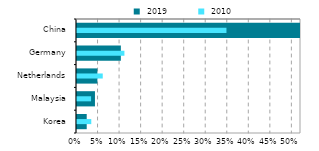
| Category |  2019 |
|---|---|
| Korea | 0.023 |
| Malaysia | 0.042 |
| Netherlands | 0.047 |
| Germany | 0.102 |
| China | 0.59 |